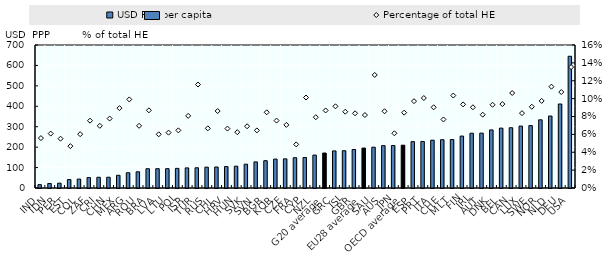
| Category | USD PPP per capita |
|---|---|
| IND | 16.37 |
| IDN | 22.124 |
| PER | 23.648 |
| EST | 41.372 |
| COL | 43.671 |
| ZAF | 51.042 |
| CRI | 52.479 |
| CHN | 52.66 |
| MEX | 62.2 |
| ARG | 74.64 |
| ROU | 79.433 |
| BRA | 94.382 |
| LVA | 94.583 |
| LTU | 94.666 |
| POL | 96.09 |
| ISR | 98.361 |
| TUR | 98.981 |
| RUS | 101.913 |
| CHL | 102.769 |
| HRV | 104.836 |
| HUN | 106.767 |
| SVK | 116.531 |
| SVN | 127.761 |
| BGR | 133.772 |
| KOR | 141.597 |
| CZE | 142.689 |
| FRA | 148.188 |
| CYP | 149.288 |
| NZL | 161.153 |
| G20 average | 171.191 |
| GRC | 181.578 |
| ISL | 182.467 |
| GBR | 188.452 |
| EU28 average | 195.448 |
| SAU | 199.837 |
| AUS | 207.306 |
| JPN | 207.87 |
| OECD average | 209.464 |
| ESP | 226.909 |
| PRT | 227.775 |
| ITA | 234.034 |
| CHE | 236.395 |
| MLT | 237.188 |
| FIN | 254.195 |
| IRL | 268.017 |
| AUT | 268.683 |
| DNK | 284.353 |
| BEL | 293.161 |
| CAN | 295.036 |
| LUX | 303.155 |
| SWE | 305.542 |
| NOR | 333.745 |
| NLD | 352.32 |
| DEU | 411.194 |
| USA | 644.796 |